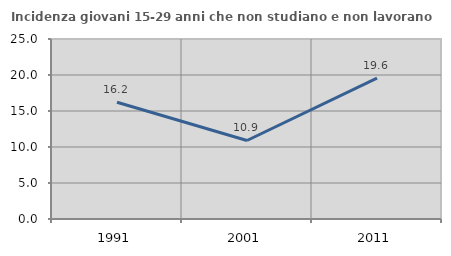
| Category | Incidenza giovani 15-29 anni che non studiano e non lavorano  |
|---|---|
| 1991.0 | 16.216 |
| 2001.0 | 10.904 |
| 2011.0 | 19.565 |